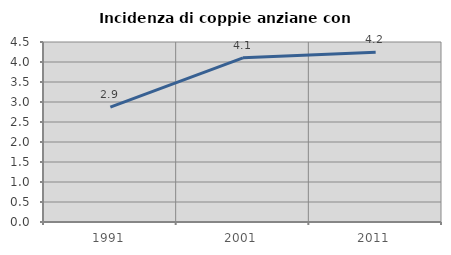
| Category | Incidenza di coppie anziane con figli |
|---|---|
| 1991.0 | 2.872 |
| 2001.0 | 4.105 |
| 2011.0 | 4.244 |